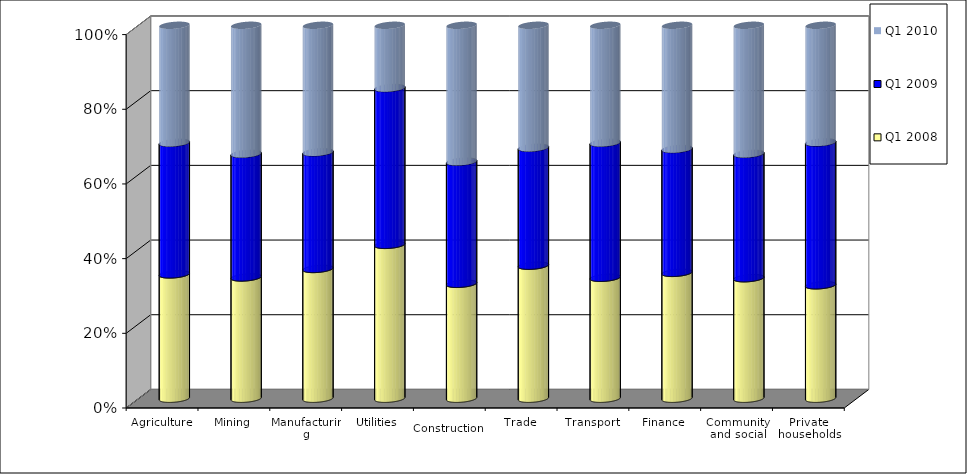
| Category | Q1 2008 | Q1 2009 | Q1 2010 |
|---|---|---|---|
| Agriculture | 5.033 | 5.328 | 4.756 |
| Mining | 0.312 | 0.318 | 0.331 |
| Manufacturing | 17.206 | 15.467 | 16.832 |
| Utilities | 0.507 | 0.517 | 0.207 |
| Construction | 8.155 | 8.668 | 9.677 |
| Trade | 23.137 | 20.517 | 21.299 |
| Transport | 6.555 | 7.316 | 6.369 |
| Finance | 11.276 | 11.093 | 11.084 |
| Community and social services | 18.884 | 19.483 | 20.141 |
| Private households | 8.935 | 11.252 | 9.222 |